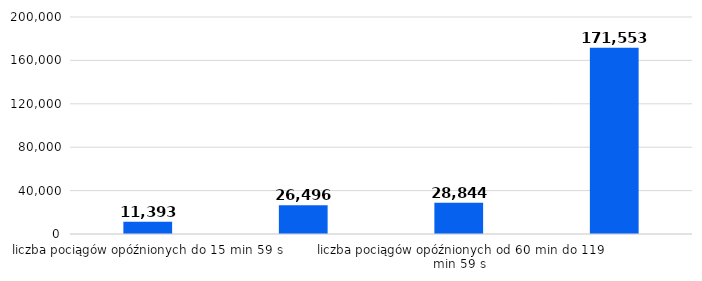
| Category | 2020 |
|---|---|
| liczba pociągów opóźnionych do 15 min 59 s | 11393 |
| liczba pociągów opóźnionych od 16 min do 59 min 59 s | 26496 |
| liczba pociągów opóźnionych od 60 min do 119 min 59 s | 28844 |
| liczba pociągów opóźnionych od 120 min | 171553 |